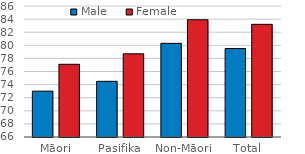
| Category | Male | Female |
|---|---|---|
| Māori | 73 | 77.1 |
| Pasifika | 74.5 | 78.7 |
| Non-Māori | 80.3 | 83.9 |
| Total | 79.5 | 83.2 |